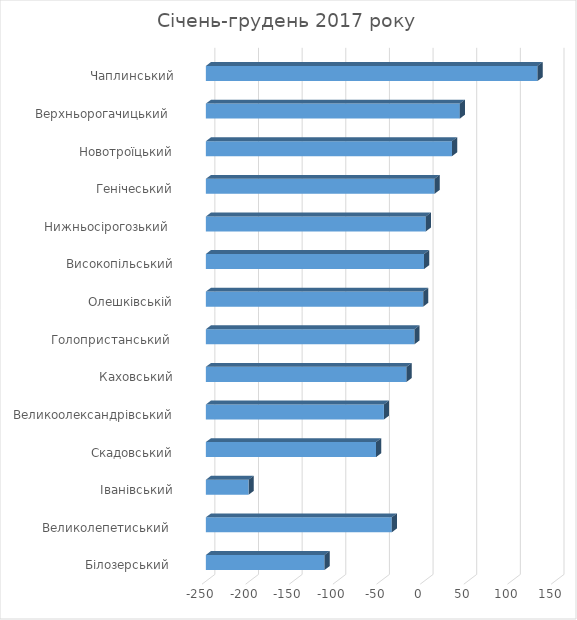
| Category | Series 0 |
|---|---|
| Білозерський  | -114 |
| Великолепетиський  | -37 |
| Іванівський | -201 |
| Скадовський | -55 |
| Великоолександрівський | -46 |
| Каховський | -20 |
| Голопристанський  | -11 |
| Олешківській | -1 |
| Високопільський | 0 |
| Нижньосірогозький  | 2 |
| Генічеський | 12 |
| Новотроїцький | 32 |
| Верхньорогачицький  | 41 |
| Чаплинський | 130 |